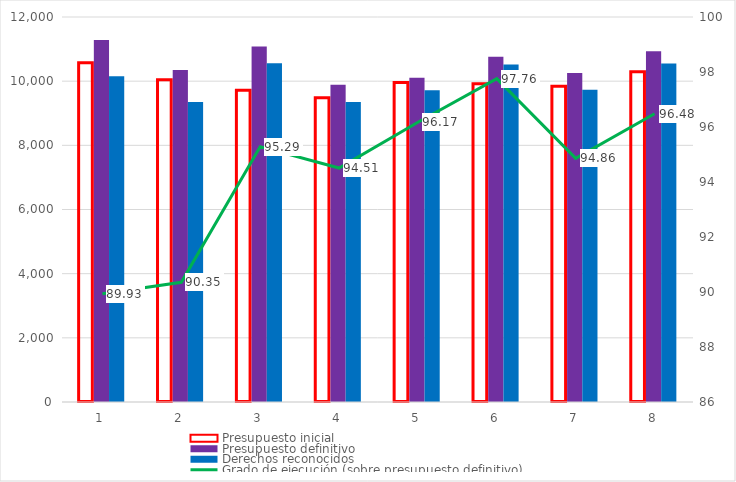
| Category | Presupuesto inicial | Presupuesto definitivo | Derechos reconocidos |
|---|---|---|---|
| 0 | 10575.537 | 11285.695 | 10149.55 |
| 1 | 10045.146 | 10347.635 | 9349.535 |
| 2 | 9720.048 | 11079.939 | 10557.61 |
| 3 | 9481.615 | 9890.285 | 9347.167 |
| 4 | 9957.791 | 10105.328 | 9718.357 |
| 5 | 9920.812 | 10763.44 | 10522.152 |
| 6 | 9843.699 | 10256.08 | 9729.066 |
| 7 | 10293.186 | 10933.955 | 10549.198 |